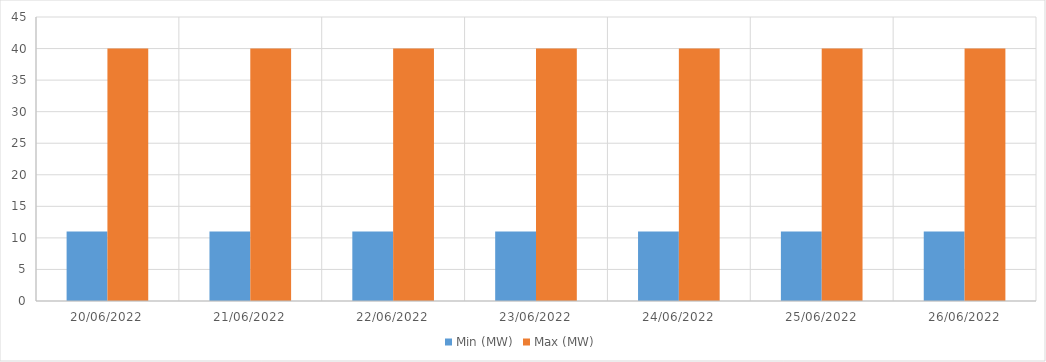
| Category | Min (MW) | Max (MW) |
|---|---|---|
| 20/06/2022 | 11 | 40 |
| 21/06/2022 | 11 | 40 |
| 22/06/2022 | 11 | 40 |
| 23/06/2022 | 11 | 40 |
| 24/06/2022 | 11 | 40 |
| 25/06/2022 | 11 | 40 |
| 26/06/2022 | 11 | 40 |